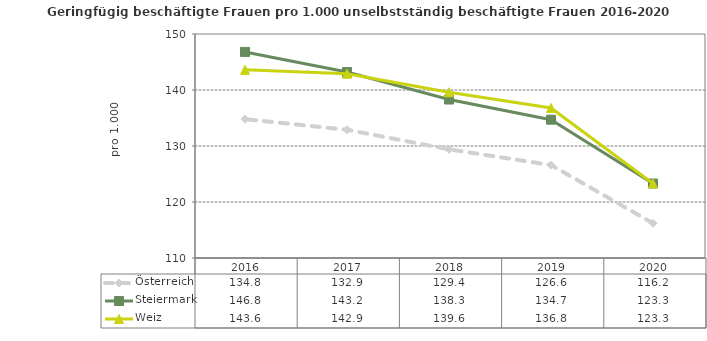
| Category | Österreich | Steiermark | Weiz |
|---|---|---|---|
| 2020.0 | 116.2 | 123.3 | 123.3 |
| 2019.0 | 126.6 | 134.7 | 136.8 |
| 2018.0 | 129.4 | 138.3 | 139.6 |
| 2017.0 | 132.9 | 143.2 | 142.9 |
| 2016.0 | 134.8 | 146.8 | 143.6 |